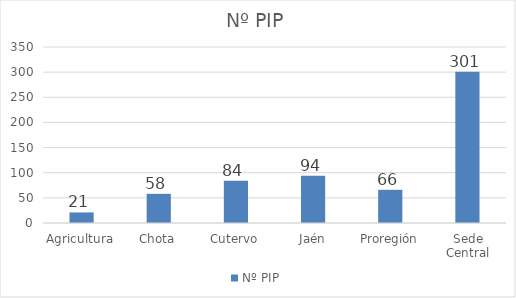
| Category | Nº PIP |
|---|---|
| Agricultura | 21 |
| Chota | 58 |
| Cutervo | 84 |
| Jaén | 94 |
| Proregión | 66 |
| Sede Central | 301 |